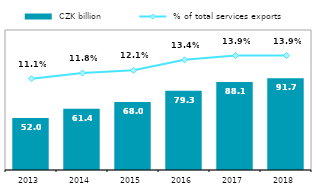
| Category |  CZK billion |
|---|---|
| 2013.0 | 52.042 |
| 2014.0 | 61.364 |
| 2015.0 | 67.988 |
| 2016.0 | 79.287 |
| 2017.0 | 88.07 |
| 2018.0 | 91.655 |